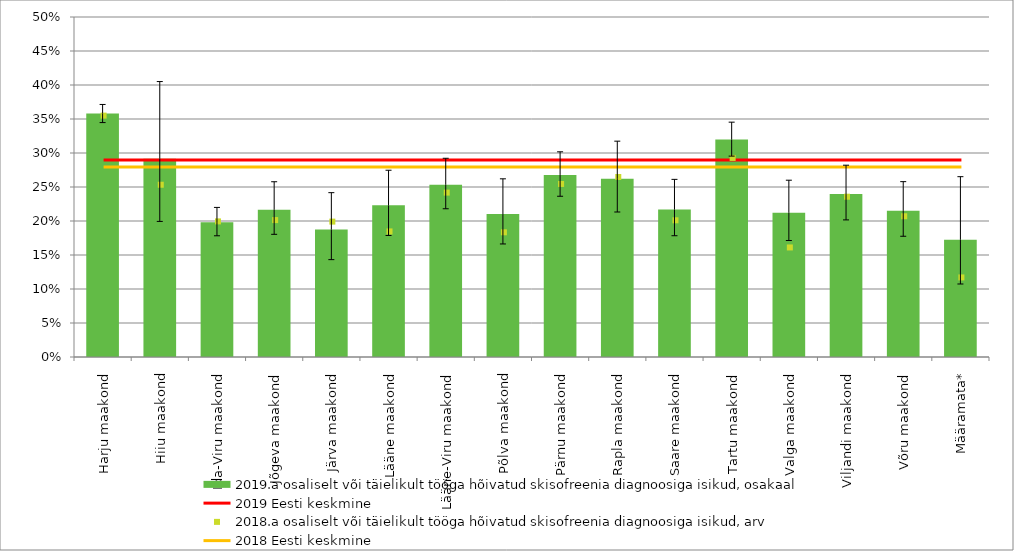
| Category | 2019.a osaliselt või täielikult tööga hõivatud skisofreenia diagnoosiga isikud, osakaal |
|---|---|
| Harju maakond | 0.358 |
| Hiiu maakond | 0.292 |
| Ida-Viru maakond | 0.198 |
| Jõgeva maakond | 0.217 |
| Järva maakond | 0.188 |
| Lääne maakond | 0.223 |
| Lääne-Viru maakond | 0.253 |
| Põlva maakond | 0.21 |
| Pärnu maakond | 0.268 |
| Rapla maakond | 0.262 |
| Saare maakond | 0.217 |
| Tartu maakond | 0.32 |
| Valga maakond | 0.212 |
| Viljandi maakond | 0.24 |
| Võru maakond | 0.215 |
| Määramata* | 0.172 |